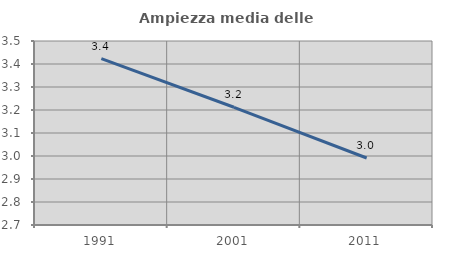
| Category | Ampiezza media delle famiglie |
|---|---|
| 1991.0 | 3.424 |
| 2001.0 | 3.212 |
| 2011.0 | 2.991 |